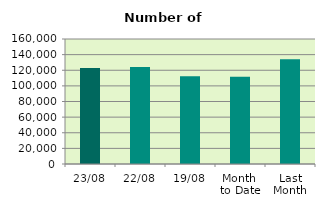
| Category | Series 0 |
|---|---|
| 23/08 | 122888 |
| 22/08 | 124136 |
| 19/08 | 112164 |
| Month 
to Date | 111655.294 |
| Last
Month | 134197.333 |